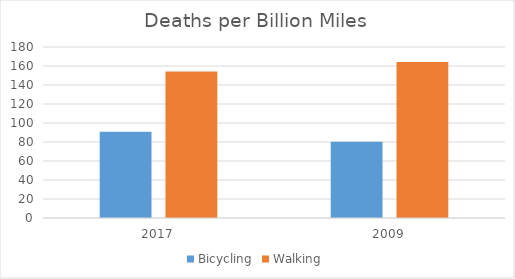
| Category | Bicycling | Walking |
|---|---|---|
| 2017.0 | 90.894 | 154.237 |
| 2009.0 | 80.268 | 164.222 |